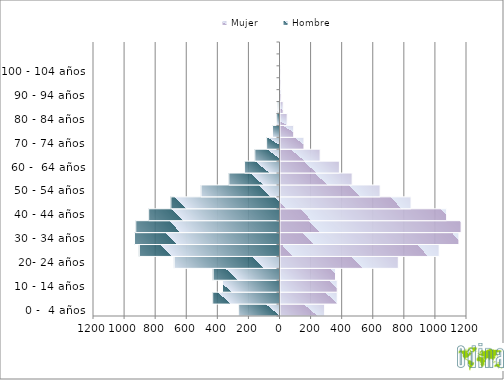
| Category | Hombre | Mujer |
|---|---|---|
| 0 -  4 años | -266 | 284 |
| 5 - 9 años | -433 | 365 |
| 10 - 14 años | -370 | 365 |
| 15 - 19 años | -430 | 354 |
| 20- 24 años | -681 | 758 |
| 25 - 29 años | -905 | 1021 |
| 30 - 34 años | -936 | 1148 |
| 35 - 39 años | -928 | 1162 |
| 40 - 44 años | -845 | 1069 |
| 45 - 49 años | -702 | 840 |
| 50 - 54 años | -508 | 641 |
| 55 - 59 años | -329 | 461 |
| 60 -  64 años | -228 | 379 |
| 65 - 69 años | -162 | 255 |
| 70 - 74 años | -86 | 151 |
| 75 - 79 años | -48 | 85 |
| 80 - 84 años | -21 | 43 |
| 85 -  89 años | -11 | 17 |
| 90 - 94 años | -2 | 6 |
| 95 - 99 años | 0 | 3 |
| 100 - 104 años | 0 | 2 |